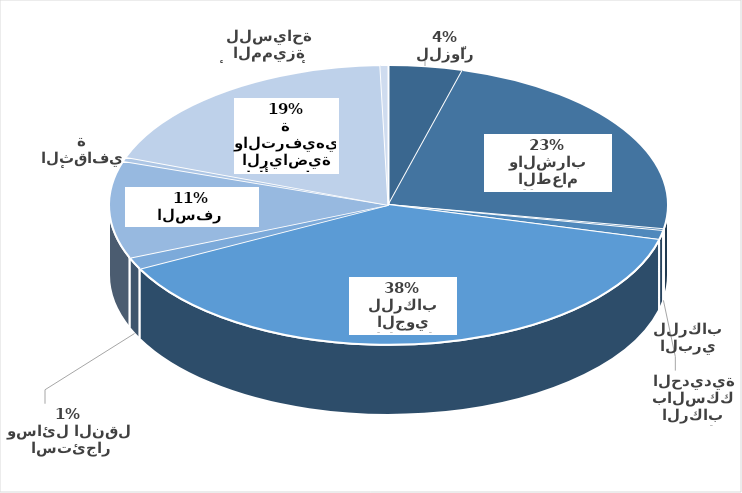
| Category | Series 0 |
|---|---|
|  الإقامة للزوّار | 796 |
| نشاط تقديم الطعام والشراب | 4366 |
|  نقل الركاب بالسكك الحديدية | 42 |
|  النقل البري للركاب | 194 |
|  النقل المائي للركاب | 0 |
|  النقل الجوي للركاب | 7141 |
|  استئجار وسائل النقل | 253 |
|   وكالات السفر  | 2089 |
| الأنشطة الثقافية | 94 |
| الأنشطة الرياضية والترفيهية | 3524 |
| الأنشطةالأخرى المميزة للسياحة | 87 |